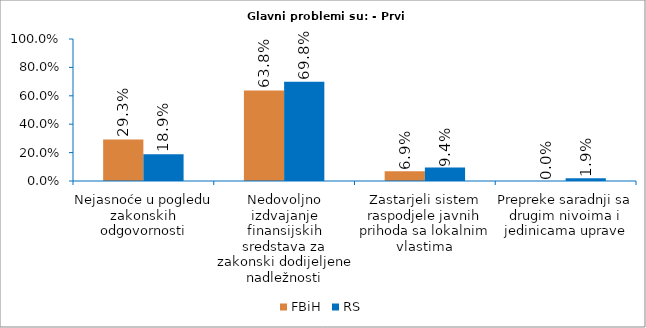
| Category | FBiH | RS |
|---|---|---|
| Nejasnoće u pogledu zakonskih odgovornosti | 0.293 | 0.189 |
| Nedovoljno izdvajanje finansijskih sredstava za zakonski dodijeljene nadležnosti | 0.638 | 0.698 |
| Zastarjeli sistem raspodjele javnih prihoda sa lokalnim vlastima | 0.069 | 0.094 |
| Prepreke saradnji sa drugim nivoima i jedinicama uprave | 0 | 0.019 |